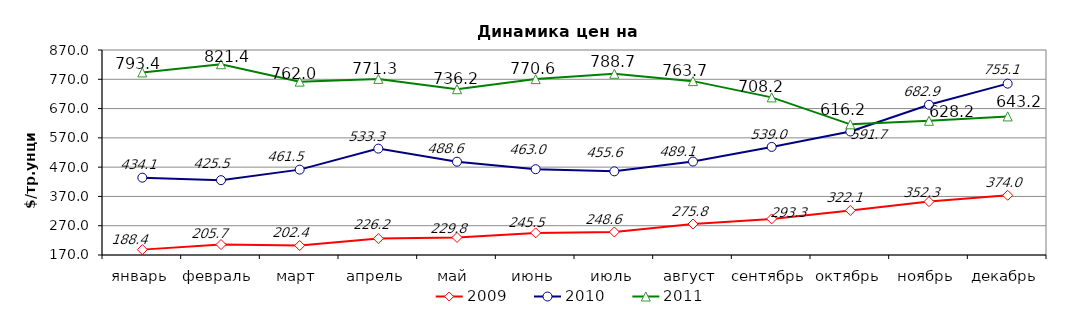
| Category | 2009 | 2010 | 2011 |
|---|---|---|---|
| январь | 188.357 | 434.1 | 793.35 |
| февраль | 205.7 | 425.5 | 821.35 |
| март | 202.364 | 461.5 | 762 |
| апрель | 226.15 | 533.25 | 771.31 |
| май | 229.816 | 488.58 | 736.15 |
| июнь | 245.52 | 463 | 770.57 |
| июль | 248.63 | 455.61 | 788.74 |
| август | 275.775 | 489.12 | 763.7 |
| сентябрь | 293.318 | 539.02 | 708.17 |
| октябрь | 322.068 | 591.71 | 616.219 |
| ноябрь | 352.286 | 682.91 | 628.23 |
| декабрь | 373.952 | 755.12 | 643.23 |